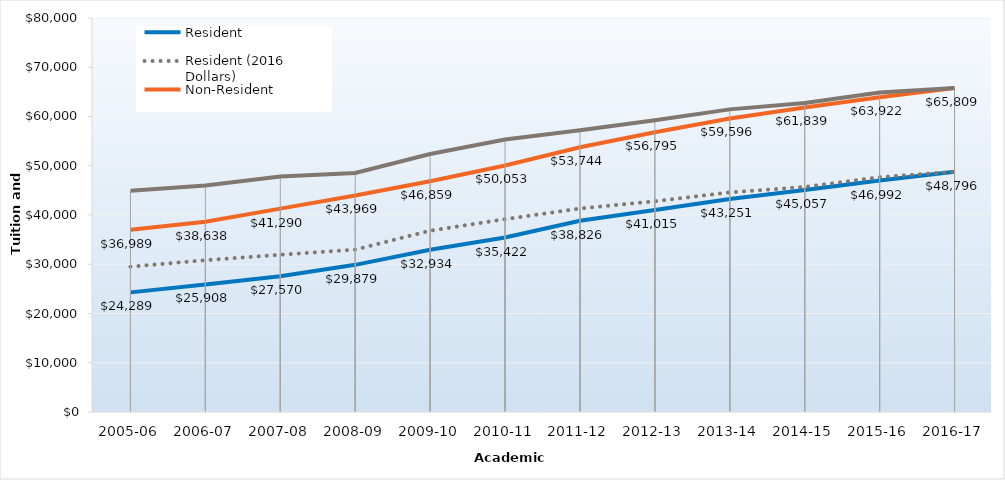
| Category | Resident | Resident (2016 Dollars) | Non-Resident | Non-Resident (2016 Dollars) |
|---|---|---|---|---|
| 2005-06 | 24289 | 29497.21 | 36989 | 44920.42 |
| 2006-07 | 25908 | 30827.58 | 38638 | 45974.84 |
| 2007-08 | 27570 | 31925.61 | 41290 | 47813.14 |
| 2008-09 | 29879 | 32971.61 | 43969 | 48519.98 |
| 2009-10 | 32934 | 36816.35 | 46859 | 52382.86 |
| 2010-11 | 35422 | 39149.89 | 50053 | 55320.69 |
| 2011-12 | 38826 | 41313.96 | 53744 | 57187.9 |
| 2012-13 | 41015 | 42791.14 | 56795 | 59254.49 |
| 2013-14 | 43251 | 44595.55 | 59596 | 61448.66 |
| 2014-15 | 45057 | 45700.02 | 61839 | 62721.52 |
| 2015-16 | 46992 | 47679.86 | 63922 | 64857.68 |
| 2016-17 | 48796 | 48796 | 65809 | 65809 |